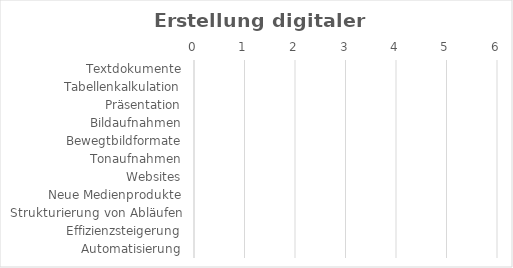
| Category | Erstellung digitaler Inhalte |
|---|---|
| Textdokumente | 0 |
| Tabellenkalkulation | 0 |
| Präsentation | 0 |
| Bildaufnahmen | 0 |
| Bewegtbildformate | 0 |
| Tonaufnahmen | 0 |
| Websites | 0 |
| Neue Medienprodukte | 0 |
| Strukturierung von Abläufen | 0 |
| Effizienzsteigerung | 0 |
| Automatisierung | 0 |